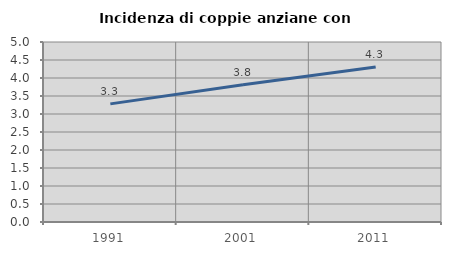
| Category | Incidenza di coppie anziane con figli |
|---|---|
| 1991.0 | 3.281 |
| 2001.0 | 3.81 |
| 2011.0 | 4.307 |